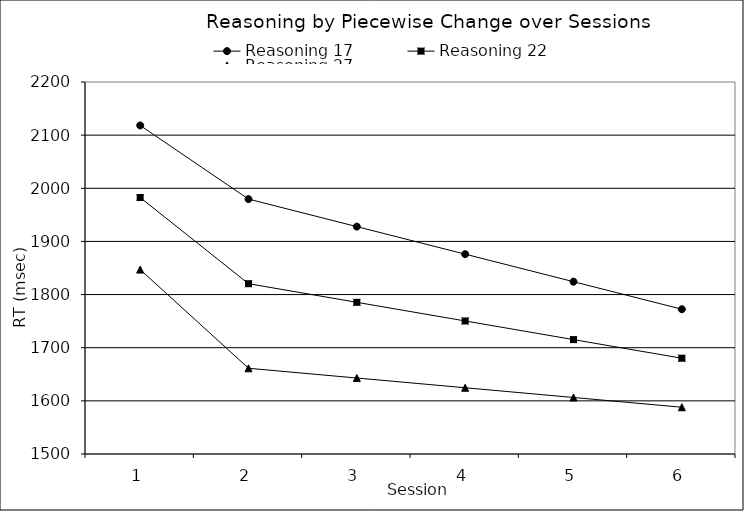
| Category | Reasoning 17 | Reasoning 22 | Reasoning 27 |
|---|---|---|---|
| 0 | 2118.24 | 1982.64 | 1847.04 |
| 1 | 1979.65 | 1820.48 | 1661.31 |
| 2 | 1927.846 | 1785.413 | 1642.981 |
| 3 | 1876.041 | 1750.346 | 1624.652 |
| 4 | 1824.236 | 1715.279 | 1606.323 |
| 5 | 1772.431 | 1680.212 | 1587.994 |